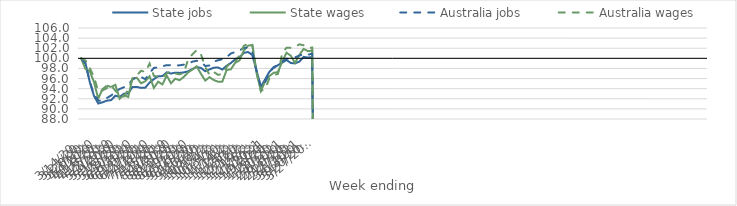
| Category | State jobs | State wages | Australia jobs | Australia wages |
|---|---|---|---|---|
| 14/03/2020 | 100 | 100 | 100 | 100 |
| 21/03/2020 | 99.117 | 97.904 | 98.97 | 99.607 |
| 28/03/2020 | 95.358 | 97.5 | 95.464 | 98.117 |
| 04/04/2020 | 92.578 | 95.312 | 92.906 | 96.324 |
| 11/04/2020 | 91.06 | 92.032 | 91.634 | 93.472 |
| 18/04/2020 | 91.305 | 93.91 | 91.618 | 93.672 |
| 25/04/2020 | 91.628 | 94.599 | 92.147 | 94.096 |
| 02/05/2020 | 91.73 | 94.33 | 92.646 | 94.684 |
| 09/05/2020 | 92.607 | 94.754 | 93.336 | 93.578 |
| 16/05/2020 | 92.382 | 92.002 | 93.928 | 92.809 |
| 23/05/2020 | 93.009 | 92.757 | 94.284 | 92.46 |
| 30/05/2020 | 93.041 | 92.346 | 94.792 | 93.812 |
| 06/06/2020 | 94.336 | 96.047 | 95.776 | 95.91 |
| 13/06/2020 | 94.346 | 96.151 | 96.277 | 96.583 |
| 20/06/2020 | 94.154 | 95.062 | 96.294 | 97.554 |
| 27/06/2020 | 94.204 | 95.464 | 95.892 | 97.289 |
| 04/07/2020 | 95.222 | 96.455 | 97.055 | 98.973 |
| 11/07/2020 | 95.887 | 94.154 | 98.106 | 96.533 |
| 18/07/2020 | 96.456 | 95.381 | 98.208 | 96.372 |
| 25/07/2020 | 96.49 | 94.834 | 98.434 | 96.181 |
| 01/08/2020 | 97.217 | 96.593 | 98.654 | 97.055 |
| 08/08/2020 | 96.99 | 95.058 | 98.656 | 97.48 |
| 15/08/2020 | 97.173 | 95.968 | 98.564 | 96.991 |
| 22/08/2020 | 97.118 | 95.665 | 98.619 | 96.84 |
| 29/08/2020 | 97.22 | 96.35 | 98.754 | 97.076 |
| 05/09/2020 | 97.426 | 97.205 | 98.928 | 99.803 |
| 12/09/2020 | 97.892 | 97.787 | 99.342 | 100.783 |
| 19/09/2020 | 98.276 | 98.418 | 99.517 | 101.637 |
| 26/09/2020 | 98.096 | 96.941 | 99.31 | 100.779 |
| 03/10/2020 | 97.449 | 95.602 | 98.488 | 98.325 |
| 10/10/2020 | 97.808 | 96.268 | 98.579 | 96.712 |
| 17/10/2020 | 98.151 | 95.702 | 99.343 | 97.299 |
| 24/10/2020 | 98.184 | 95.382 | 99.616 | 96.732 |
| 31/10/2020 | 97.785 | 95.394 | 99.832 | 96.893 |
| 07/11/2020 | 98.533 | 97.68 | 100.231 | 98.252 |
| 14/11/2020 | 99.074 | 97.833 | 100.956 | 99.261 |
| 21/11/2020 | 99.818 | 99.119 | 101.258 | 99.291 |
| 28/11/2020 | 100.201 | 99.579 | 101.546 | 100.638 |
| 05/12/2020 | 101.061 | 101.504 | 102.06 | 102.456 |
| 12/12/2020 | 101.254 | 102.498 | 102.096 | 102.885 |
| 19/12/2020 | 100.652 | 102.651 | 101.265 | 102.743 |
| 26/12/2020 | 97.592 | 97.102 | 97.433 | 97.212 |
| 02/01/2021 | 94.372 | 93.531 | 94.376 | 93.531 |
| 09/01/2021 | 95.85 | 95.452 | 95.285 | 93.978 |
| 16/01/2021 | 97.362 | 96.512 | 97.349 | 96.028 |
| 23/01/2021 | 98.105 | 97.134 | 98.277 | 96.664 |
| 30/01/2021 | 98.651 | 97.28 | 98.681 | 96.928 |
| 06/02/2021 | 99.153 | 99.362 | 99.348 | 101.023 |
| 13/02/2021 | 99.663 | 101.111 | 99.928 | 102.099 |
| 20/02/2021 | 99.073 | 100.507 | 99.969 | 102.073 |
| 27/02/2021 | 99.005 | 99.077 | 100.21 | 102.312 |
| 06/03/2021 | 99.348 | 100.684 | 100.53 | 102.759 |
| 13/03/2021 | 100.292 | 101.856 | 100.859 | 102.584 |
| 20/03/2021 | 100.143 | 101.418 | 100.674 | 102.081 |
| 27/03/2021 | 100.267 | 101.549 | 100.974 | 102.126 |